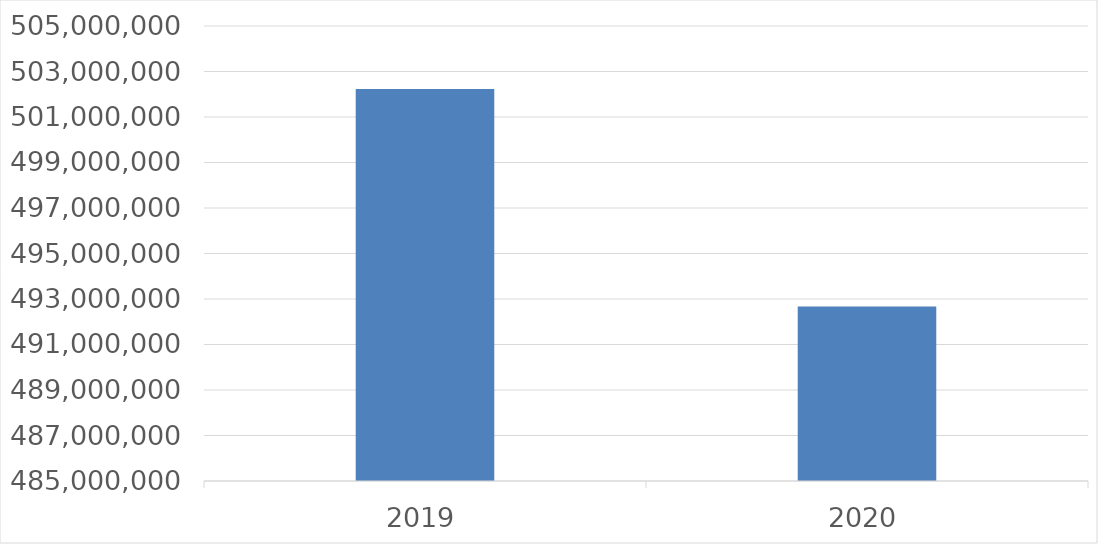
| Category | Series 0 |
|---|---|
| 2019 | 502232993 |
| 2020 | 492673536 |